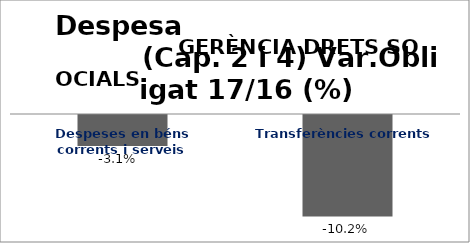
| Category | Series 0 |
|---|---|
| Despeses en béns corrents i serveis | -0.031 |
| Transferències corrents | -0.102 |